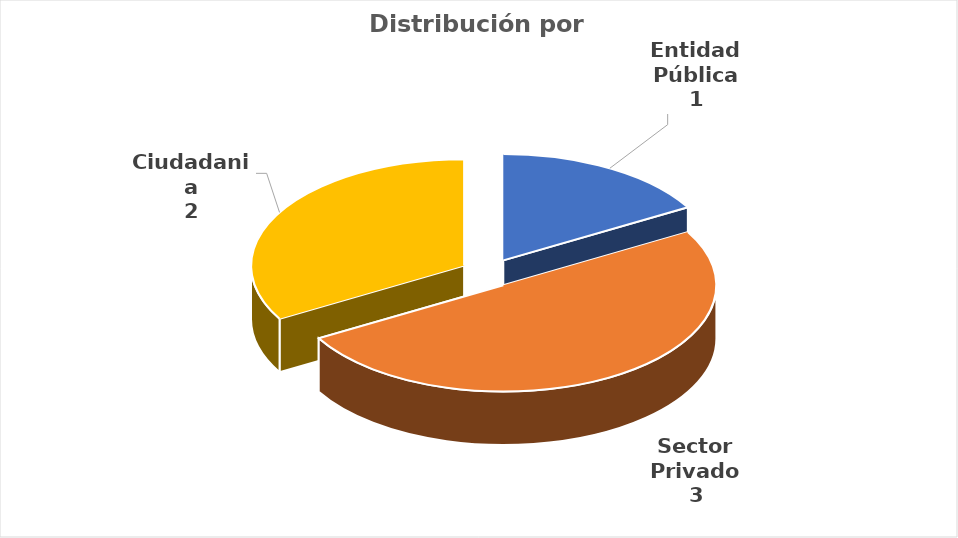
| Category | Series 0 |
|---|---|
| Entidad Pública | 1 |
| Sector Privado | 3 |
| Ciudadania | 2 |